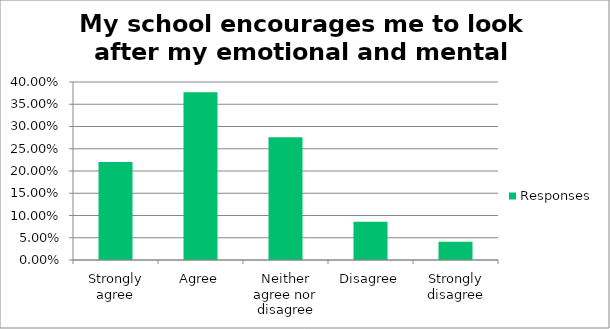
| Category | Responses |
|---|---|
| Strongly agree | 0.22 |
| Agree | 0.377 |
| Neither agree nor disagree | 0.276 |
| Disagree | 0.086 |
| Strongly disagree | 0.041 |